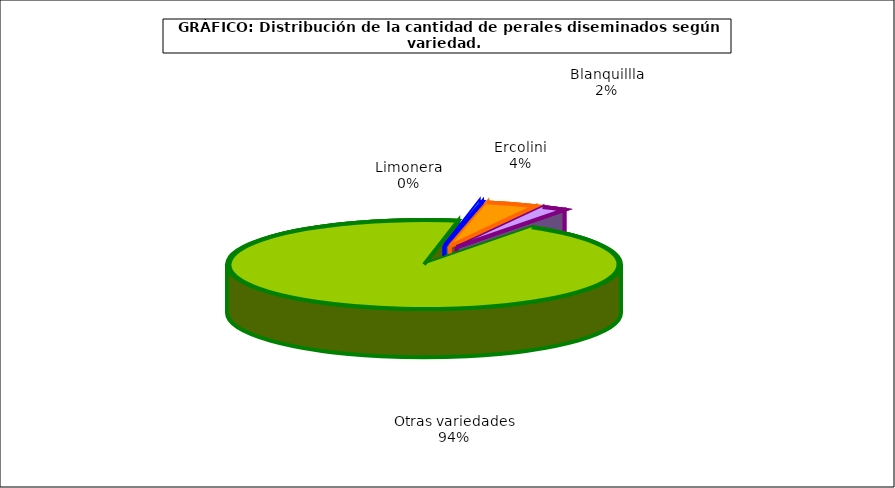
| Category | arboles |
|---|---|
| 0 | 1.37 |
| 1 | 20.507 |
| 2 | 10.162 |
| 3 | 466.169 |